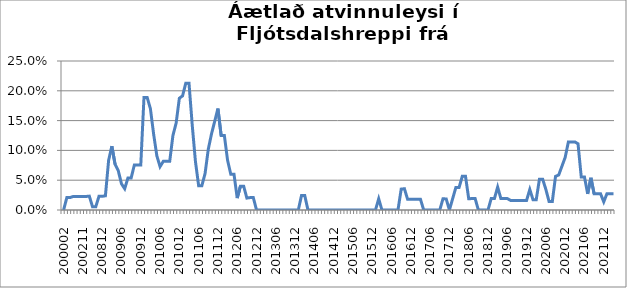
| Category | Series 0 |
|---|---|
| 200002 | 0 |
| 200102 | 0.021 |
| 200103 | 0.021 |
| 200111 | 0.023 |
| 200112 | 0.023 |
| 200201 | 0.023 |
| 200211 | 0.023 |
| 200212 | 0.023 |
| 200302 | 0.023 |
| 200409 | 0.005 |
| 200410 | 0.005 |
| 200811 | 0.023 |
| 200812 | 0.023 |
| 200901 | 0.024 |
| 200902 | 0.083 |
| 200903 | 0.107 |
| 200904 | 0.077 |
| 200905 | 0.066 |
| 200906 | 0.044 |
| 200907 | 0.036 |
| 200908 | 0.054 |
| 200909 | 0.054 |
| 200910 | 0.075 |
| 200911 | 0.075 |
| 200912 | 0.075 |
| 201001 | 0.189 |
| 201002 | 0.189 |
| 201003 | 0.17 |
| 201004 | 0.127 |
| 201005 | 0.091 |
| 201006 | 0.073 |
| 201007 | 0.082 |
| 201008 | 0.082 |
| 201009 | 0.082 |
| 201010 | 0.125 |
| 201011 | 0.146 |
| 201012 | 0.188 |
| 201101 | 0.191 |
| 201102 | 0.213 |
| 201103 | 0.213 |
| 201104 | 0.143 |
| 201105 | 0.082 |
| 201106 | 0.041 |
| 201107 | 0.041 |
| 201108 | 0.061 |
| 201109 | 0.102 |
| 201110 | 0.128 |
| 201111 | 0.149 |
| 201112 | 0.17 |
| 201201 | 0.125 |
| 201202 | 0.125 |
| 201203 | 0.083 |
| 201204 | 0.06 |
| 201205 | 0.06 |
| 201206 | 0.02 |
| 201207 | 0.04 |
| 201208 | 0.04 |
| 201209 | 0.02 |
| 201210 | 0.021 |
| 201211 | 0.021 |
| 201212 | 0 |
| 201301 | 0 |
| 201302 | 0 |
| 201303 | 0 |
| 201304 | 0 |
| 201305 | 0 |
| 201306 | 0 |
| 201307 | 0 |
| 201308 | 0 |
| 201309 | 0 |
| 201310 | 0 |
| 201311 | 0 |
| 201312 | 0 |
| 201401 | 0 |
| 201402 | 0.024 |
| 201403 | 0.024 |
| 201404 | 0 |
| 201405 | 0 |
| 201406 | 0 |
| 201407 | 0 |
| 201408 | 0 |
| 201409 | 0 |
| 201410 | 0 |
| 201411 | 0 |
| 201412 | 0 |
| 201501 | 0 |
| 201502 | 0 |
| 201503 | 0 |
| 201504 | 0 |
| 201505 | 0 |
| 201506 | 0 |
| 201507 | 0 |
| 201508 | 0 |
| 201509 | 0 |
| 201510 | 0 |
| 201511 | 0 |
| 201512 | 0 |
| 201601 | 0 |
| 201602 | 0.019 |
| 201603 | 0 |
| 201604 | 0 |
| 201605 | 0 |
| 201606 | 0 |
| 201607 | 0 |
| 201608 | 0 |
| 201609 | 0.035 |
| 201610 | 0.036 |
| 201611 | 0.018 |
| 201612 | 0.018 |
| 201701 | 0.018 |
| 201702 | 0.018 |
| 201703 | 0.018 |
| 201704 | 0 |
| 201705 | 0 |
| 201706 | 0 |
| 201707 | 0 |
| 201708 | 0 |
| 201709 | 0 |
| 201710 | 0.019 |
| 201711 | 0.019 |
| 201712 | 0 |
| 201801 | 0.019 |
| 201802 | 0.038 |
| 201803 | 0.038 |
| 201804 | 0.057 |
| 201805 | 0.057 |
| 201806 | 0.019 |
| 201807 | 0.019 |
| 201808 | 0.019 |
| 201809 | 0 |
| 201810 | 0 |
| 201811 | 0 |
| 201812 | 0 |
| 201901 | 0.019 |
| 201902 | 0.019 |
| 201903 | 0.038 |
| 201904 | 0.019 |
| 201905 | 0.019 |
| 201906 | 0.019 |
| 201907 | 0.016 |
| 201908 | 0.016 |
| 201909 | 0.016 |
| 201910 | 0.016 |
| 201911 | 0.016 |
| 201912 | 0.016 |
| 202001 | 0.034 |
| 202002 | 0.017 |
| 202003*** | 0.017 |
| 202004 | 0.052 |
| 202005 | 0.052 |
| 202006 | 0.034 |
| 202007 | 0.014 |
| 202008 | 0.014 |
| 202009 | 0.056 |
| 202010 | 0.059 |
| 202011 | 0.074 |
| 202012 | 0.088 |
| 202101 | 0.114 |
| 202102 | 0.114 |
| 202103 | 0.114 |
| 202104 | 0.111 |
| 202105 | 0.056 |
| 202106 | 0.056 |
| 202107 | 0.027 |
| 202108 | 0.054 |
| 202109 | 0.027 |
| 202110 | 0.027 |
| 202111 | 0.027 |
| 202112 | 0.014 |
| 202201 | 0.027 |
| 202202 | 0.027 |
| 202203 | 0.027 |